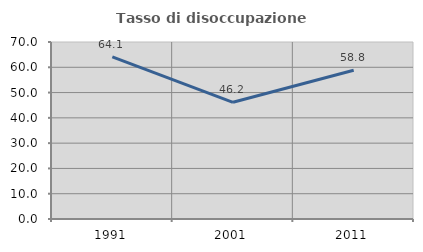
| Category | Tasso di disoccupazione giovanile  |
|---|---|
| 1991.0 | 64.103 |
| 2001.0 | 46.154 |
| 2011.0 | 58.824 |